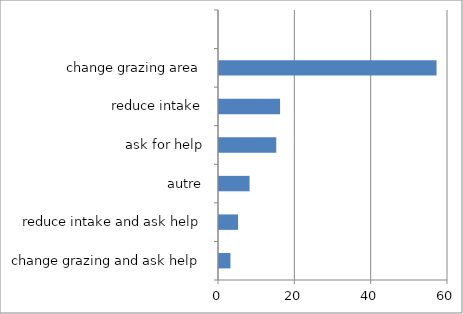
| Category | Series 0 |
|---|---|
| change grazing and ask help | 3 |
| reduce intake and ask help | 5 |
| autre | 8 |
| ask for help | 15 |
| reduce intake | 16 |
| change grazing area | 57 |